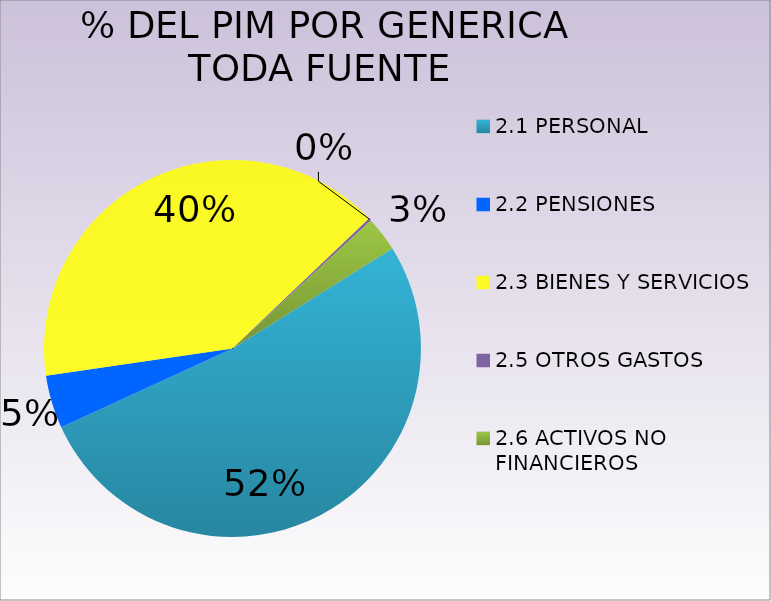
| Category | Series 0 |
|---|---|
| 2.1 PERSONAL | 26927333 |
| 2.2 PENSIONES | 2356422 |
| 2.3 BIENES Y SERVICIOS | 20811751 |
| 2.5 OTROS GASTOS  | 113222 |
| 2.6 ACTIVOS NO FINANCIEROS  | 1550406 |